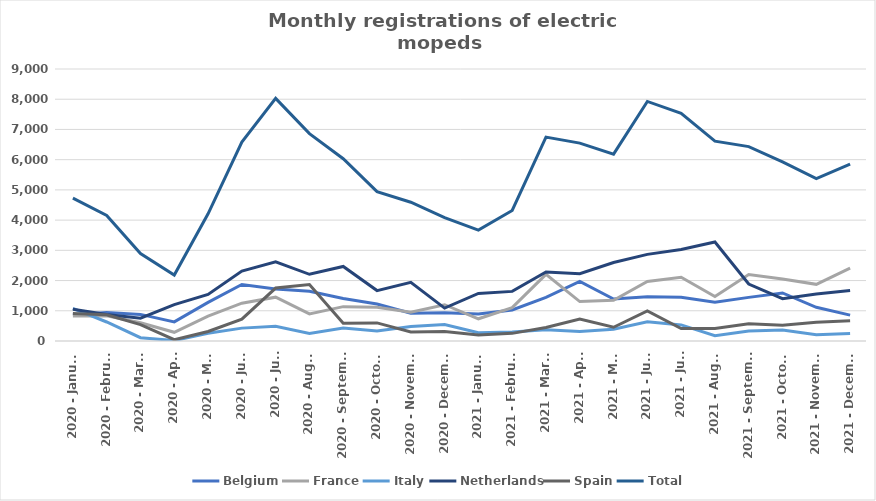
| Category | Belgium | France | Italy | Netherlands | Spain | Total |
|---|---|---|---|---|---|---|
| 2020 - January | 867 | 825 | 1079 | 1048 | 911 | 4730 |
| 2020 - February | 944 | 838 | 629 | 877 | 866 | 4154 |
| 2020 - March | 880 | 605 | 110 | 754 | 544 | 2893 |
| 2020 - April | 633 | 288 | 15 | 1205 | 42 | 2183 |
| 2020 - May | 1279 | 821 | 255 | 1541 | 314 | 4210 |
| 2020 - June | 1869 | 1251 | 426 | 2315 | 723 | 6584 |
| 2020 - July | 1721 | 1450 | 485 | 2620 | 1752 | 8028 |
| 2020 - August | 1645 | 896 | 249 | 2207 | 1866 | 6863 |
| 2020 - September | 1409 | 1137 | 432 | 2467 | 587 | 6032 |
| 2020 - October | 1225 | 1116 | 333 | 1668 | 599 | 4941 |
| 2020 - November | 920 | 949 | 483 | 1940 | 300 | 4592 |
| 2020 - December | 933 | 1201 | 546 | 1088 | 311 | 4079 |
| 2021 - January | 892 | 735 | 272 | 1572 | 200 | 3671 |
| 2021 - February | 1025 | 1103 | 295 | 1642 | 253 | 4318 |
| 2021 - March | 1443 | 2206 | 369 | 2282 | 448 | 6748 |
| 2021 - April | 1973 | 1305 | 316 | 2225 | 729 | 6548 |
| 2021 - May | 1391 | 1350 | 391 | 2598 | 454 | 6184 |
| 2021 - June | 1461 | 1970 | 637 | 2866 | 992 | 7926 |
| 2021 - July | 1449 | 2108 | 533 | 3029 | 414 | 7533 |
| 2021 - August | 1279 | 1470 | 173 | 3275 | 416 | 6613 |
| 2021 - September | 1444 | 2202 | 334 | 1884 | 569 | 6433 |
| 2021 - October | 1589 | 2053 | 362 | 1398 | 524 | 5926 |
| 2021 - November | 1115 | 1875 | 206 | 1554 | 621 | 5371 |
| 2021 - December | 856 | 2409 | 250 | 1671 | 667 | 5853 |